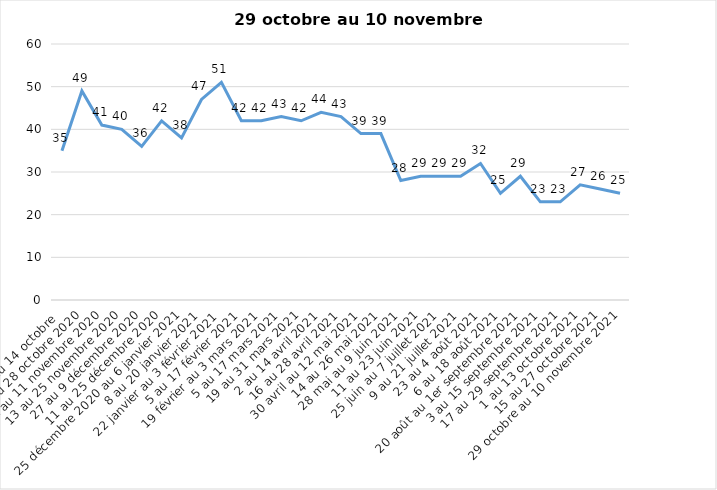
| Category | Toujours aux trois mesures |
|---|---|
| 2 au 14 octobre  | 35 |
| 16 au 28 octobre 2020 | 49 |
| 30 octobre au 11 novembre 2020 | 41 |
| 13 au 25 novembre 2020 | 40 |
| 27 au 9 décembre 2020 | 36 |
| 11 au 25 décembre 2020 | 42 |
| 25 décembre 2020 au 6 janvier 2021 | 38 |
| 8 au 20 janvier 2021 | 47 |
| 22 janvier au 3 février 2021 | 51 |
| 5 au 17 février 2021 | 42 |
| 19 février au 3 mars 2021 | 42 |
| 5 au 17 mars 2021 | 43 |
| 19 au 31 mars 2021 | 42 |
| 2 au 14 avril 2021 | 44 |
| 16 au 28 avril 2021 | 43 |
| 30 avril au 12 mai 2021 | 39 |
| 14 au 26 mai 2021 | 39 |
| 28 mai au 9 juin 2021 | 28 |
| 11 au 23 juin 2021 | 29 |
| 25 juin au 7 juillet 2021 | 29 |
| 9 au 21 juillet 2021 | 29 |
| 23 au 4 août 2021 | 32 |
| 6 au 18 août 2021 | 25 |
| 20 août au 1er septembre 2021 | 29 |
| 3 au 15 septembre 2021 | 23 |
| 17 au 29 septembre 2021 | 23 |
| 1 au 13 octobre 2021 | 27 |
| 15 au 27 octobre 2021 | 26 |
| 29 octobre au 10 novembre 2021 | 25 |